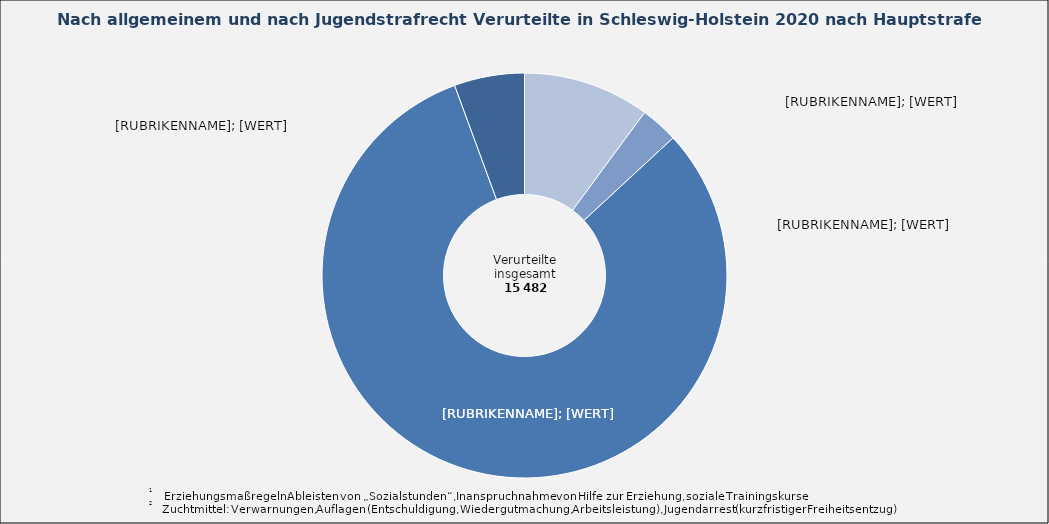
| Category | in Prozent |
|---|---|
| Freiheits- /Jugendstrafe mit Strafaussetzung zur Bewährung | 0.101 |
| Freiheits- /Jugendstrafe ohne Strafaussetzung zur Bewährung | 0.03 |
| Geldstrafe | 0.812 |
| Erziehungsmaßregeln (1), Zuchtmittel (2) | 0.056 |